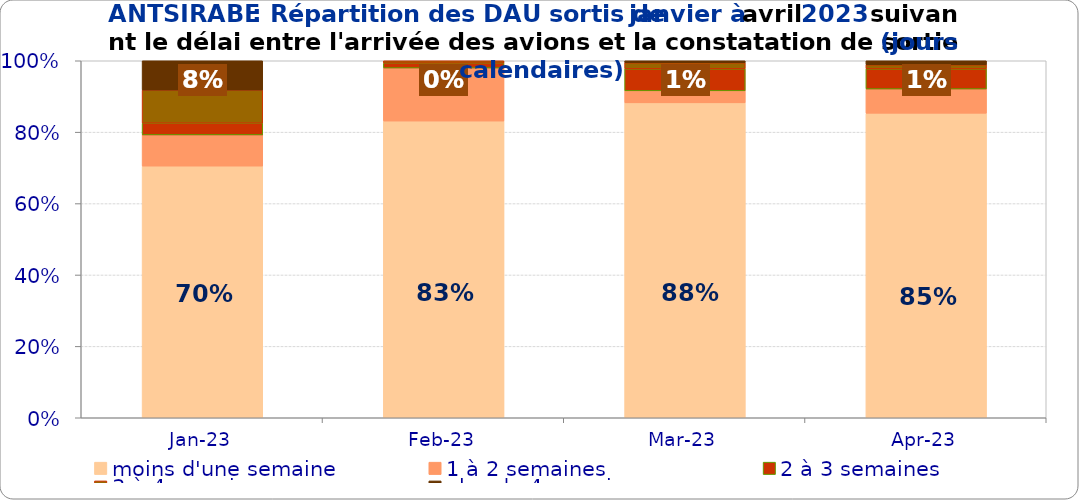
| Category | moins d'une semaine | 1 à 2 semaines | 2 à 3 semaines | 3 à 4 semaines | plus de 4 semaines |
|---|---|---|---|---|---|
| 2023-01-01 | 0.705 | 0.087 | 0.033 | 0.093 | 0.082 |
| 2023-02-01 | 0.831 | 0.149 | 0.014 | 0.007 | 0 |
| 2023-03-01 | 0.882 | 0.034 | 0.062 | 0.017 | 0.006 |
| 2023-04-01 | 0.853 | 0.068 | 0.056 | 0.011 | 0.011 |